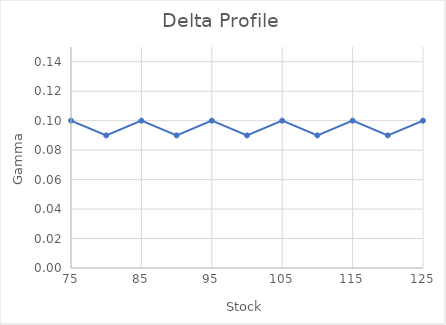
| Category | Delta |
|---|---|
| 75.0 | 0.1 |
| 80.0 | 0.09 |
| 85.0 | 0.1 |
| 90.0 | 0.09 |
| 95.0 | 0.1 |
| 100.0 | 0.09 |
| 105.0 | 0.1 |
| 110.0 | 0.09 |
| 115.0 | 0.1 |
| 120.0 | 0.09 |
| 125.0 | 0.1 |